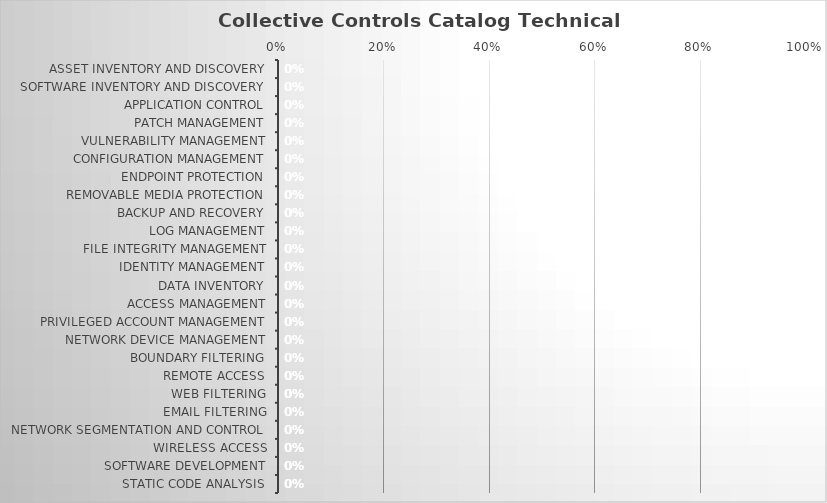
| Category | Score: |
|---|---|
| Asset Inventory and Discovery | 0 |
| Software Inventory and Discovery | 0 |
| Application Control | 0 |
| Patch Management | 0 |
| Vulnerability Management | 0 |
| Configuration Management | 0 |
| Endpoint Protection | 0 |
| Removable Media Protection | 0 |
| Backup and Recovery | 0 |
| Log Management | 0 |
| File Integrity Management | 0 |
| Identity Management | 0 |
| Data Inventory | 0 |
| Access Management | 0 |
| Privileged Account Management | 0 |
| Network Device Management | 0 |
| Boundary Filtering | 0 |
| Remote Access | 0 |
| Web Filtering | 0 |
| Email Filtering | 0 |
| Network Segmentation and Control | 0 |
| Wireless Access | 0 |
| Software Development | 0 |
| Static Code Analysis | 0 |